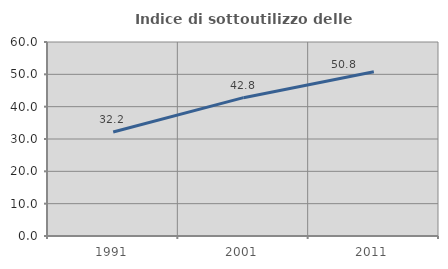
| Category | Indice di sottoutilizzo delle abitazioni  |
|---|---|
| 1991.0 | 32.17 |
| 2001.0 | 42.785 |
| 2011.0 | 50.769 |